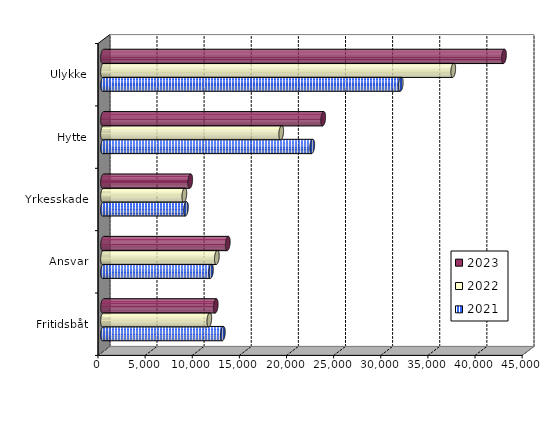
| Category | 2021 | 2022 | 2023 |
|---|---|---|---|
| Fritidsbåt | 12717.946 | 11276.932 | 11960.347 |
| Ansvar | 11455.784 | 12078.237 | 13236.988 |
| Yrkesskade | 8798.661 | 8629.697 | 9255.16 |
| Hytte | 22199 | 18907.302 | 23362.87 |
| Ulykke | 31589.073 | 37157.663 | 42542.303 |